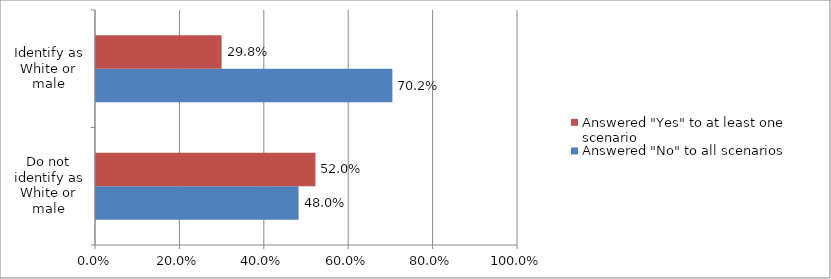
| Category | Answered "No" to all scenarios | Answered "Yes" to at least one scenario |
|---|---|---|
| Do not identify as White or male | 0.48 | 0.52 |
| Identify as White or male | 0.702 | 0.298 |